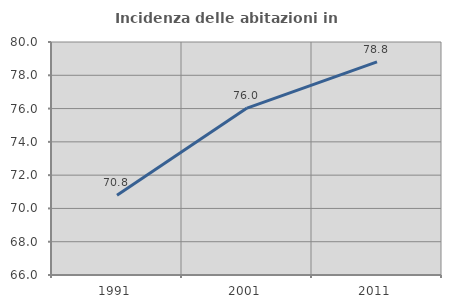
| Category | Incidenza delle abitazioni in proprietà  |
|---|---|
| 1991.0 | 70.787 |
| 2001.0 | 76.03 |
| 2011.0 | 78.807 |